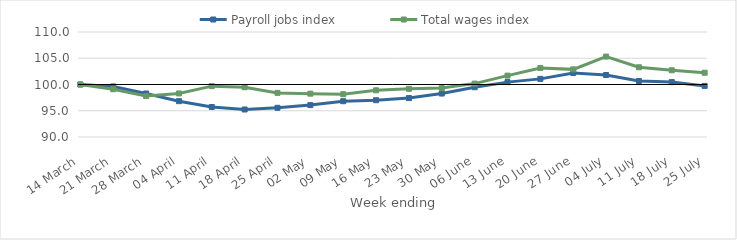
| Category | Payroll jobs index | Total wages index |
|---|---|---|
| 2020-03-14 | 100 | 100 |
| 2020-03-21 | 99.63 | 99.1 |
| 2020-03-28 | 98.287 | 97.795 |
| 2020-04-04 | 96.826 | 98.297 |
| 2020-04-11 | 95.714 | 99.685 |
| 2020-04-18 | 95.238 | 99.475 |
| 2020-04-25 | 95.558 | 98.403 |
| 2020-05-02 | 96.077 | 98.256 |
| 2020-05-09 | 96.816 | 98.151 |
| 2020-05-16 | 97.006 | 98.893 |
| 2020-05-23 | 97.414 | 99.177 |
| 2020-05-30 | 98.276 | 99.323 |
| 2020-06-06 | 99.478 | 100.172 |
| 2020-06-13 | 100.453 | 101.692 |
| 2020-06-20 | 101.071 | 103.156 |
| 2020-06-27 | 102.196 | 102.882 |
| 2020-07-04 | 101.812 | 105.32 |
| 2020-07-11 | 100.677 | 103.281 |
| 2020-07-18 | 100.459 | 102.711 |
| 2020-07-25 | 99.731 | 102.244 |